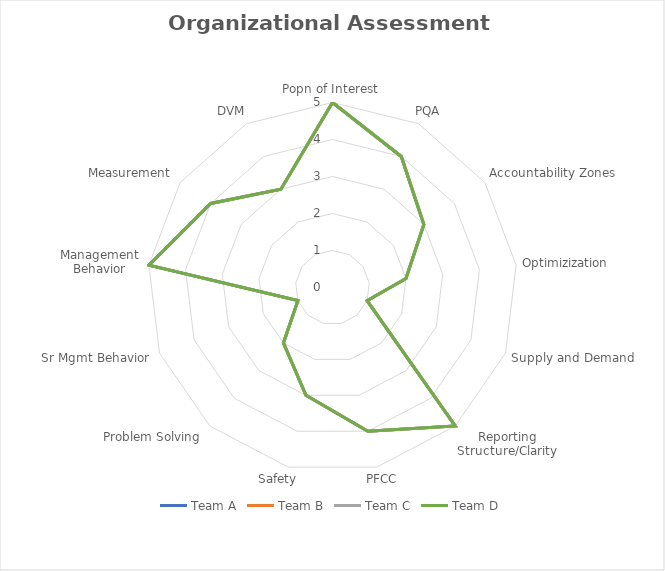
| Category | Team A | Team B | Team C | Team D |
|---|---|---|---|---|
| Popn of Interest | 5 | 5 | 5 | 5 |
| PQA | 4 | 4 | 4 | 4 |
| Accountability Zones | 3 | 3 | 3 | 3 |
| Optimizization  | 2 | 2 | 2 | 2 |
| Supply and Demand | 1 | 1 | 1 | 1 |
| Reporting Structure/Clarity | 5 | 5 | 5 | 5 |
| PFCC | 4 | 4 | 4 | 4 |
| Safety | 3 | 3 | 3 | 3 |
| Problem Solving  | 2 | 2 | 2 | 2 |
| Sr Mgmt Behavior | 1 | 1 | 1 | 1 |
| Management Behavior | 5 | 5 | 5 | 5 |
| Measurement | 4 | 4 | 4 | 4 |
| DVM | 3 | 3 | 3 | 3 |